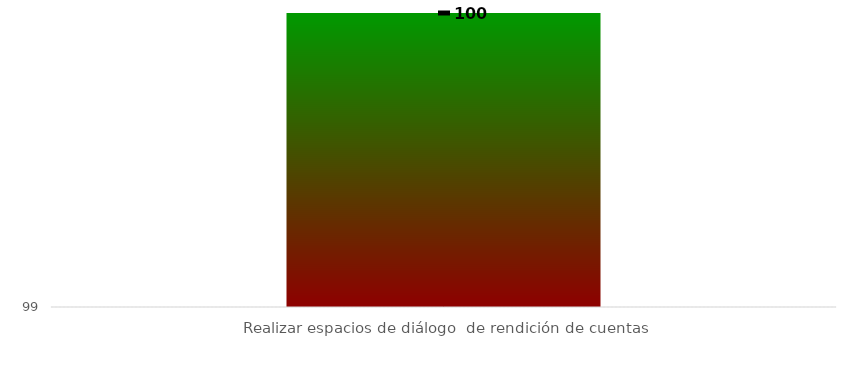
| Category | Rangos |
|---|---|
| Realizar espacios de diálogo  de rendición de cuentas | 100 |